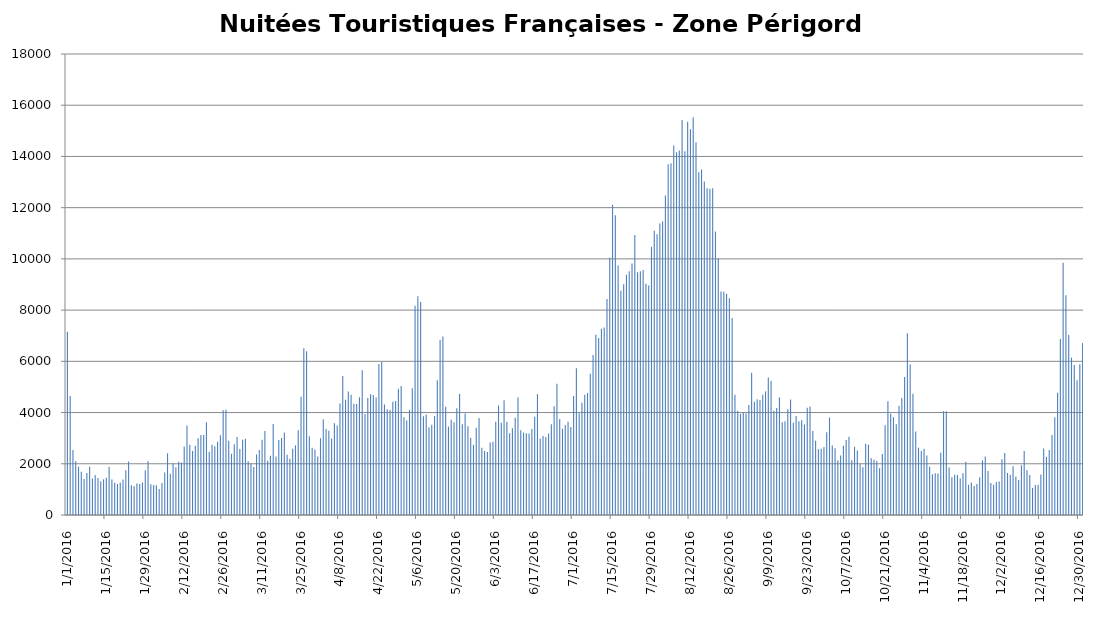
| Category | Nuitées Françaises |
|---|---|
| 1/1/16 | 7158 |
| 1/2/16 | 4649 |
| 1/3/16 | 2537 |
| 1/4/16 | 2102 |
| 1/5/16 | 1889 |
| 1/6/16 | 1685 |
| 1/7/16 | 1405 |
| 1/8/16 | 1640 |
| 1/9/16 | 1884 |
| 1/10/16 | 1428 |
| 1/11/16 | 1564 |
| 1/12/16 | 1444 |
| 1/13/16 | 1313 |
| 1/14/16 | 1394 |
| 1/15/16 | 1453 |
| 1/16/16 | 1887 |
| 1/17/16 | 1384 |
| 1/18/16 | 1260 |
| 1/19/16 | 1213 |
| 1/20/16 | 1273 |
| 1/21/16 | 1386 |
| 1/22/16 | 1746 |
| 1/23/16 | 2086 |
| 1/24/16 | 1160 |
| 1/25/16 | 1126 |
| 1/26/16 | 1232 |
| 1/27/16 | 1211 |
| 1/28/16 | 1275 |
| 1/29/16 | 1751 |
| 1/30/16 | 2103 |
| 1/31/16 | 1197 |
| 2/1/16 | 1167 |
| 2/2/16 | 1160 |
| 2/3/16 | 1019 |
| 2/4/16 | 1248 |
| 2/5/16 | 1663 |
| 2/6/16 | 2411 |
| 2/7/16 | 1607 |
| 2/8/16 | 2017 |
| 2/9/16 | 1862 |
| 2/10/16 | 2079 |
| 2/11/16 | 2050 |
| 2/12/16 | 2676 |
| 2/13/16 | 3490 |
| 2/14/16 | 2747 |
| 2/15/16 | 2503 |
| 2/16/16 | 2704 |
| 2/17/16 | 3001 |
| 2/18/16 | 3125 |
| 2/19/16 | 3127 |
| 2/20/16 | 3623 |
| 2/21/16 | 2466 |
| 2/22/16 | 2742 |
| 2/23/16 | 2684 |
| 2/24/16 | 2858 |
| 2/25/16 | 3113 |
| 2/26/16 | 4090 |
| 2/27/16 | 4106 |
| 2/28/16 | 2898 |
| 2/29/16 | 2391 |
| 3/1/16 | 2765 |
| 3/2/16 | 3048 |
| 3/3/16 | 2580 |
| 3/4/16 | 2941 |
| 3/5/16 | 2982 |
| 3/6/16 | 2097 |
| 3/7/16 | 2009 |
| 3/8/16 | 1877 |
| 3/9/16 | 2366 |
| 3/10/16 | 2539 |
| 3/11/16 | 2941 |
| 3/12/16 | 3278 |
| 3/13/16 | 2122 |
| 3/14/16 | 2316 |
| 3/15/16 | 3550 |
| 3/16/16 | 2280 |
| 3/17/16 | 2933 |
| 3/18/16 | 3006 |
| 3/19/16 | 3217 |
| 3/20/16 | 2348 |
| 3/21/16 | 2198 |
| 3/22/16 | 2587 |
| 3/23/16 | 2716 |
| 3/24/16 | 3310 |
| 3/25/16 | 4618 |
| 3/26/16 | 6513 |
| 3/27/16 | 6396 |
| 3/28/16 | 3078 |
| 3/29/16 | 2623 |
| 3/30/16 | 2558 |
| 3/31/16 | 2285 |
| 4/1/16 | 3000 |
| 4/2/16 | 3741 |
| 4/3/16 | 3361 |
| 4/4/16 | 3293 |
| 4/5/16 | 2983 |
| 4/6/16 | 3579 |
| 4/7/16 | 3498 |
| 4/8/16 | 4349 |
| 4/9/16 | 5427 |
| 4/10/16 | 4497 |
| 4/11/16 | 4823 |
| 4/12/16 | 4694 |
| 4/13/16 | 4343 |
| 4/14/16 | 4337 |
| 4/15/16 | 4596 |
| 4/16/16 | 5655 |
| 4/17/16 | 3942 |
| 4/18/16 | 4566 |
| 4/19/16 | 4716 |
| 4/20/16 | 4687 |
| 4/21/16 | 4587 |
| 4/22/16 | 5896 |
| 4/23/16 | 5973 |
| 4/24/16 | 4317 |
| 4/25/16 | 4127.5 |
| 4/26/16 | 4104 |
| 4/27/16 | 4419 |
| 4/28/16 | 4450 |
| 4/29/16 | 4934 |
| 4/30/16 | 5037 |
| 5/1/16 | 3814 |
| 5/2/16 | 3689 |
| 5/3/16 | 4104 |
| 5/4/16 | 4946 |
| 5/5/16 | 8166 |
| 5/6/16 | 8543 |
| 5/7/16 | 8320 |
| 5/8/16 | 3852 |
| 5/9/16 | 3926 |
| 5/10/16 | 3430 |
| 5/11/16 | 3528 |
| 5/12/16 | 3864 |
| 5/13/16 | 5266 |
| 5/14/16 | 6839 |
| 5/15/16 | 6974 |
| 5/16/16 | 4230 |
| 5/17/16 | 3450 |
| 5/18/16 | 3719 |
| 5/19/16 | 3625 |
| 5/20/16 | 4168 |
| 5/21/16 | 4721 |
| 5/22/16 | 3540 |
| 5/23/16 | 3961 |
| 5/24/16 | 3470 |
| 5/25/16 | 3020 |
| 5/26/16 | 2737 |
| 5/27/16 | 3410 |
| 5/28/16 | 3792 |
| 5/29/16 | 2627 |
| 5/30/16 | 2497 |
| 5/31/16 | 2461 |
| 6/1/16 | 2829 |
| 6/2/16 | 2856 |
| 6/3/16 | 3644 |
| 6/4/16 | 4279 |
| 6/5/16 | 3601 |
| 6/6/16 | 4482 |
| 6/7/16 | 3637 |
| 6/8/16 | 3189 |
| 6/9/16 | 3384 |
| 6/10/16 | 3793 |
| 6/11/16 | 4593 |
| 6/12/16 | 3308 |
| 6/13/16 | 3218 |
| 6/14/16 | 3191 |
| 6/15/16 | 3184 |
| 6/16/16 | 3360 |
| 6/17/16 | 3836 |
| 6/18/16 | 4720 |
| 6/19/16 | 2991 |
| 6/20/16 | 3082 |
| 6/21/16 | 3049 |
| 6/22/16 | 3178 |
| 6/23/16 | 3544 |
| 6/24/16 | 4243 |
| 6/25/16 | 5120 |
| 6/26/16 | 3749 |
| 6/27/16 | 3367 |
| 6/28/16 | 3511 |
| 6/29/16 | 3639 |
| 6/30/16 | 3436 |
| 7/1/16 | 4649 |
| 7/2/16 | 5734 |
| 7/3/16 | 3971 |
| 7/4/16 | 4380 |
| 7/5/16 | 4695 |
| 7/6/16 | 4763 |
| 7/7/16 | 5516 |
| 7/8/16 | 6251 |
| 7/9/16 | 7042 |
| 7/10/16 | 6913 |
| 7/11/16 | 7273 |
| 7/12/16 | 7323 |
| 7/13/16 | 8437 |
| 7/14/16 | 10042 |
| 7/15/16 | 12110 |
| 7/16/16 | 11700 |
| 7/17/16 | 9744 |
| 7/18/16 | 8754 |
| 7/19/16 | 9011 |
| 7/20/16 | 9386 |
| 7/21/16 | 9520 |
| 7/22/16 | 9817 |
| 7/23/16 | 10932 |
| 7/24/16 | 9479 |
| 7/25/16 | 9515 |
| 7/26/16 | 9569 |
| 7/27/16 | 9026 |
| 7/28/16 | 8965 |
| 7/29/16 | 10473 |
| 7/30/16 | 11094 |
| 7/31/16 | 10962 |
| 8/1/16 | 11386 |
| 8/2/16 | 11462 |
| 8/3/16 | 12473 |
| 8/4/16 | 13700 |
| 8/5/16 | 13735 |
| 8/6/16 | 14432 |
| 8/7/16 | 14165 |
| 8/8/16 | 14230 |
| 8/9/16 | 15425 |
| 8/10/16 | 14205 |
| 8/11/16 | 15353 |
| 8/12/16 | 15062 |
| 8/13/16 | 15534 |
| 8/14/16 | 14551 |
| 8/15/16 | 13380 |
| 8/16/16 | 13491 |
| 8/17/16 | 13023 |
| 8/18/16 | 12758 |
| 8/19/16 | 12742 |
| 8/20/16 | 12754 |
| 8/21/16 | 11074 |
| 8/22/16 | 10024 |
| 8/23/16 | 8722 |
| 8/24/16 | 8716 |
| 8/25/16 | 8635 |
| 8/26/16 | 8466 |
| 8/27/16 | 7691 |
| 8/28/16 | 4698 |
| 8/29/16 | 4069 |
| 8/30/16 | 3953 |
| 8/31/16 | 3991 |
| 9/1/16 | 3968 |
| 9/2/16 | 4295 |
| 9/3/16 | 5554 |
| 9/4/16 | 4419 |
| 9/5/16 | 4515 |
| 9/6/16 | 4486 |
| 9/7/16 | 4694 |
| 9/8/16 | 4827 |
| 9/9/16 | 5367 |
| 9/10/16 | 5228 |
| 9/11/16 | 4074 |
| 9/12/16 | 4173 |
| 9/13/16 | 4583 |
| 9/14/16 | 3620 |
| 9/15/16 | 3656 |
| 9/16/16 | 4133 |
| 9/17/16 | 4506 |
| 9/18/16 | 3598 |
| 9/19/16 | 3870 |
| 9/20/16 | 3656 |
| 9/21/16 | 3702 |
| 9/22/16 | 3532 |
| 9/23/16 | 4191 |
| 9/24/16 | 4234 |
| 9/25/16 | 3280 |
| 9/26/16 | 2899 |
| 9/27/16 | 2570 |
| 9/28/16 | 2591 |
| 9/29/16 | 2655 |
| 9/30/16 | 3229 |
| 10/1/16 | 3807 |
| 10/2/16 | 2709 |
| 10/3/16 | 2607 |
| 10/4/16 | 2129 |
| 10/5/16 | 2326 |
| 10/6/16 | 2708 |
| 10/7/16 | 2933 |
| 10/8/16 | 3053 |
| 10/9/16 | 2136 |
| 10/10/16 | 2660 |
| 10/11/16 | 2520 |
| 10/12/16 | 1980 |
| 10/13/16 | 1862 |
| 10/14/16 | 2778 |
| 10/15/16 | 2742 |
| 10/16/16 | 2214 |
| 10/17/16 | 2158 |
| 10/18/16 | 2113 |
| 10/19/16 | 1830 |
| 10/20/16 | 2378 |
| 10/21/16 | 3507 |
| 10/22/16 | 4445 |
| 10/23/16 | 3950 |
| 10/24/16 | 3820 |
| 10/25/16 | 3543 |
| 10/26/16 | 4268 |
| 10/27/16 | 4572 |
| 10/28/16 | 5385 |
| 10/29/16 | 7097 |
| 10/30/16 | 5881 |
| 10/31/16 | 4731 |
| 11/1/16 | 3260 |
| 11/2/16 | 2630 |
| 11/3/16 | 2503 |
| 11/4/16 | 2586 |
| 11/5/16 | 2325 |
| 11/6/16 | 1885 |
| 11/7/16 | 1592 |
| 11/8/16 | 1627 |
| 11/9/16 | 1616 |
| 11/10/16 | 2426 |
| 11/11/16 | 4054 |
| 11/12/16 | 4052 |
| 11/13/16 | 1852 |
| 11/14/16 | 1471 |
| 11/15/16 | 1575 |
| 11/16/16 | 1558 |
| 11/17/16 | 1422 |
| 11/18/16 | 1629 |
| 11/19/16 | 2081 |
| 11/20/16 | 1180 |
| 11/21/16 | 1268 |
| 11/22/16 | 1134 |
| 11/23/16 | 1213 |
| 11/24/16 | 1475 |
| 11/25/16 | 2134 |
| 11/26/16 | 2280 |
| 11/27/16 | 1718 |
| 11/28/16 | 1252 |
| 11/29/16 | 1177 |
| 11/30/16 | 1289 |
| 12/1/16 | 1312 |
| 12/2/16 | 2174 |
| 12/3/16 | 2421 |
| 12/4/16 | 1639 |
| 12/5/16 | 1570 |
| 12/6/16 | 1906 |
| 12/7/16 | 1501 |
| 12/8/16 | 1368 |
| 12/9/16 | 1947 |
| 12/10/16 | 2498 |
| 12/11/16 | 1746 |
| 12/12/16 | 1564 |
| 12/13/16 | 1058 |
| 12/14/16 | 1173 |
| 12/15/16 | 1178 |
| 12/16/16 | 1586 |
| 12/17/16 | 2598 |
| 12/18/16 | 2274 |
| 12/19/16 | 2535 |
| 12/20/16 | 3124 |
| 12/21/16 | 3816 |
| 12/22/16 | 4771 |
| 12/23/16 | 6871 |
| 12/24/16 | 9849 |
| 12/25/16 | 8585 |
| 12/26/16 | 7029 |
| 12/27/16 | 6144 |
| 12/28/16 | 5852 |
| 12/29/16 | 5262 |
| 12/30/16 | 5886 |
| 12/31/16 | 6711 |